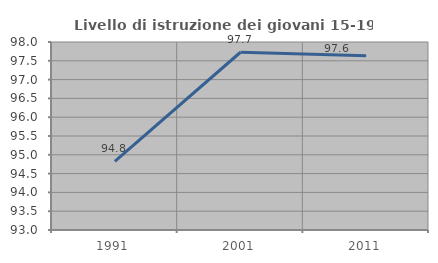
| Category | Livello di istruzione dei giovani 15-19 anni |
|---|---|
| 1991.0 | 94.828 |
| 2001.0 | 97.727 |
| 2011.0 | 97.633 |